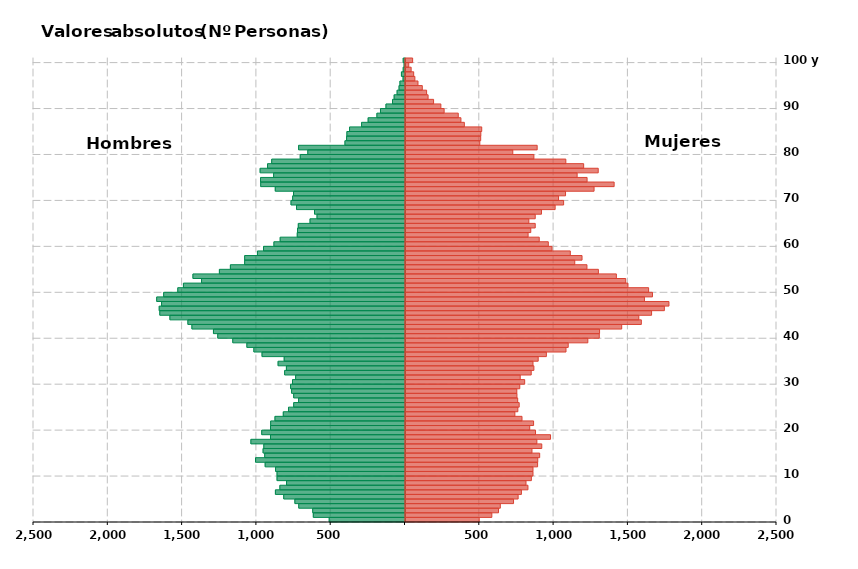
| Category | Hombres | Mujeres |
|---|---|---|
| 0 | -510 | 496 |
| 1 | -617 | 581 |
| 2 | -621 | 626 |
| 3 | -715 | 638 |
| 4 | -741 | 727 |
| 5 | -816 | 758 |
| 6 | -872 | 780 |
| 7 | -842 | 824 |
| 8 | -797 | 811 |
| 9 | -861 | 847 |
| 10 | -861 | 858 |
| 11 | -871 | 858 |
| 12 | -941 | 889 |
| 13 | -1006 | 890 |
| 14 | -944 | 903 |
| 15 | -955 | 851 |
| 16 | -950 | 917 |
| 17 | -1037 | 884 |
| 18 | -905 | 976 |
| 19 | -964 | 875 |
| 20 | -905 | 836 |
| 21 | -904 | 862 |
| 22 | -875 | 784 |
| 23 | -819 | 736 |
| 24 | -784 | 756 |
| 25 | -749 | 765 |
| 26 | -716 | 755 |
| 27 | -749 | 750 |
| 28 | -763 | 749 |
| 29 | -770 | 769 |
| 30 | -757 | 802 |
| 31 | -736 | 772 |
| 32 | -810 | 846 |
| 33 | -798 | 864 |
| 34 | -854 | 858 |
| 35 | -813 | 893 |
| 36 | -962 | 948 |
| 37 | -1017 | 1080 |
| 38 | -1064 | 1095 |
| 39 | -1159 | 1227 |
| 40 | -1260 | 1304 |
| 41 | -1289 | 1306 |
| 42 | -1434 | 1455 |
| 43 | -1461 | 1587 |
| 44 | -1582 | 1570 |
| 45 | -1650 | 1656 |
| 46 | -1654 | 1742 |
| 47 | -1638 | 1773 |
| 48 | -1671 | 1608 |
| 49 | -1624 | 1662 |
| 50 | -1529 | 1636 |
| 51 | -1491 | 1497 |
| 52 | -1369 | 1482 |
| 53 | -1427 | 1419 |
| 54 | -1249 | 1298 |
| 55 | -1175 | 1221 |
| 56 | -1079 | 1139 |
| 57 | -1079 | 1188 |
| 58 | -993 | 1109 |
| 59 | -952 | 986 |
| 60 | -882 | 961 |
| 61 | -840 | 900 |
| 62 | -725 | 825 |
| 63 | -723 | 843 |
| 64 | -718 | 873 |
| 65 | -639 | 830 |
| 66 | -592 | 873 |
| 67 | -609 | 915 |
| 68 | -730 | 1007 |
| 69 | -767 | 1064 |
| 70 | -756 | 1030 |
| 71 | -750 | 1077 |
| 72 | -873 | 1269 |
| 73 | -971 | 1404 |
| 74 | -972 | 1222 |
| 75 | -884 | 1155 |
| 76 | -975 | 1297 |
| 77 | -925 | 1199 |
| 78 | -897 | 1079 |
| 79 | -705 | 864 |
| 80 | -654 | 722 |
| 81 | -716 | 886 |
| 82 | -404 | 500 |
| 83 | -393 | 506 |
| 84 | -391 | 507 |
| 85 | -373 | 513 |
| 86 | -292 | 396 |
| 87 | -248 | 373 |
| 88 | -189 | 355 |
| 89 | -165 | 260 |
| 90 | -128 | 238 |
| 91 | -84 | 189 |
| 92 | -73 | 152 |
| 93 | -53 | 142 |
| 94 | -40 | 113 |
| 95 | -34 | 84 |
| 96 | -13 | 63 |
| 97 | -24 | 55 |
| 98 | -12 | 38 |
| 99 | -6 | 22 |
| 100 | -12 | 48 |